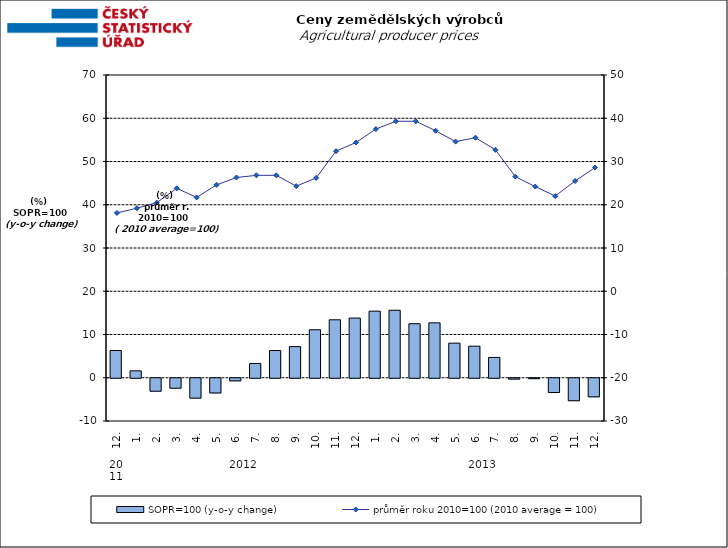
| Category | SOPR=100 (y-o-y change)   |
|---|---|
| 0 | 6.3 |
| 1 | 1.6 |
| 2 | -3 |
| 3 | -2.3 |
| 4 | -4.6 |
| 5 | -3.4 |
| 6 | -0.6 |
| 7 | 3.3 |
| 8 | 6.3 |
| 9 | 7.2 |
| 10 | 11.1 |
| 11 | 13.4 |
| 12 | 13.8 |
| 13 | 15.4 |
| 14 | 15.6 |
| 15 | 12.5 |
| 16 | 12.7 |
| 17 | 8 |
| 18 | 7.3 |
| 19 | 4.7 |
| 20 | -0.2 |
| 21 | -0.1 |
| 22 | -3.3 |
| 23 | -5.2 |
| 24 | -4.3 |